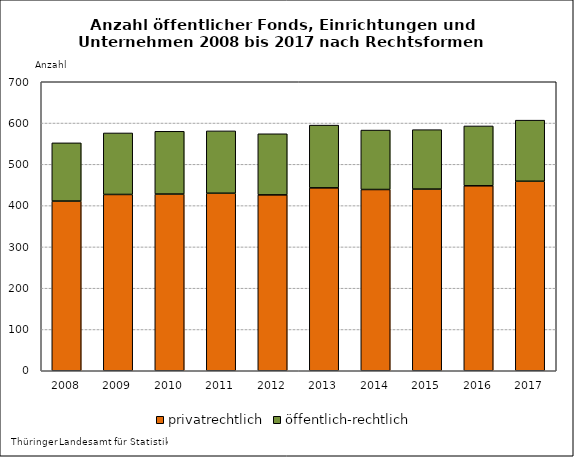
| Category | privatrechtlich | öffentlich-rechtlich |
|---|---|---|
| 2008.0 | 411 | 141 |
| 2009.0 | 427 | 149 |
| 2010.0 | 428 | 152 |
| 2011.0 | 430 | 151 |
| 2012.0 | 426 | 148 |
| 2013.0 | 443 | 152 |
| 2014.0 | 439 | 144 |
| 2015.0 | 440 | 144 |
| 2016.0 | 448 | 145 |
| 2017.0 | 459 | 148 |